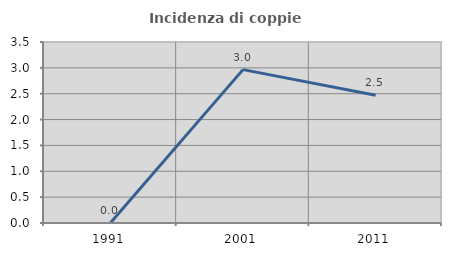
| Category | Incidenza di coppie miste |
|---|---|
| 1991.0 | 0 |
| 2001.0 | 2.966 |
| 2011.0 | 2.469 |